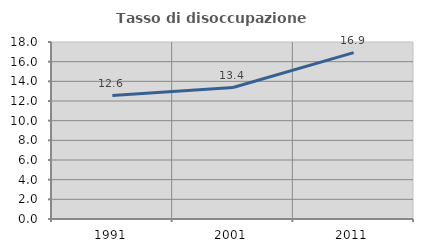
| Category | Tasso di disoccupazione giovanile  |
|---|---|
| 1991.0 | 12.551 |
| 2001.0 | 13.372 |
| 2011.0 | 16.923 |